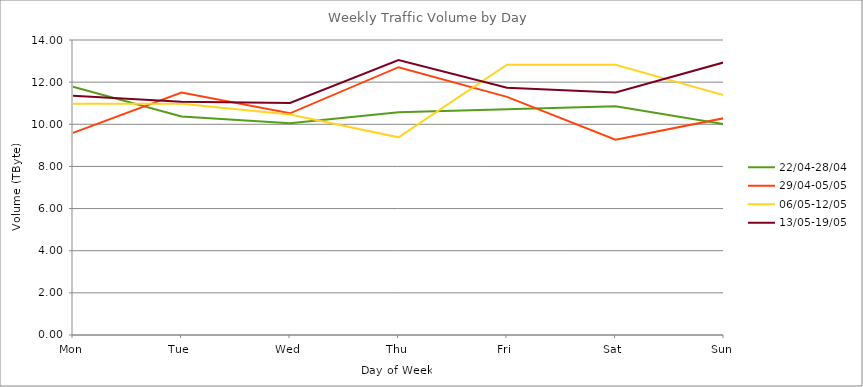
| Category | 22/04-28/04 | 29/04-05/05 | 06/05-12/05 | 13/05-19/05 |
|---|---|---|---|---|
| Mon | 11.78 | 9.59 | 10.98 | 11.35 |
| Tue | 10.37 | 11.51 | 10.97 | 11.07 |
| Wed | 10.05 | 10.52 | 10.46 | 11.01 |
| Thu | 10.57 | 12.71 | 9.38 | 13.05 |
| Fri | 10.71 | 11.3 | 12.83 | 11.73 |
| Sat | 10.85 | 9.27 | 12.82 | 11.51 |
| Sun | 10.01 | 10.29 | 11.38 | 12.94 |